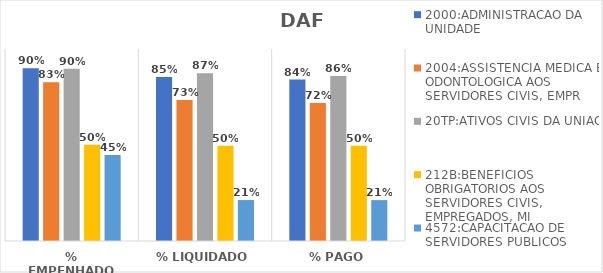
| Category | 2000:ADMINISTRACAO DA UNIDADE | 2004:ASSISTENCIA MEDICA E ODONTOLOGICA AOS SERVIDORES CIVIS, EMPR | 20TP:ATIVOS CIVIS DA UNIAO | 212B:BENEFICIOS OBRIGATORIOS AOS SERVIDORES CIVIS, EMPREGADOS, MI | 4572:CAPACITACAO DE SERVIDORES PUBLICOS FEDERAIS EM PROCESSO DE Q |
|---|---|---|---|---|---|
| % EMPENHADO | 0.899 | 0.827 | 0.898 | 0.501 | 0.448 |
| % LIQUIDADO | 0.854 | 0.734 | 0.873 | 0.496 | 0.213 |
| % PAGO | 0.841 | 0.719 | 0.86 | 0.496 | 0.213 |